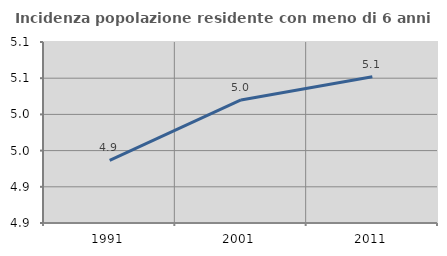
| Category | Incidenza popolazione residente con meno di 6 anni |
|---|---|
| 1991.0 | 4.937 |
| 2001.0 | 5.02 |
| 2011.0 | 5.052 |